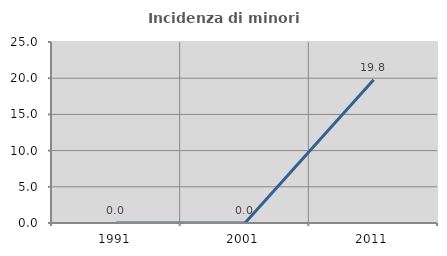
| Category | Incidenza di minori stranieri |
|---|---|
| 1991.0 | 0 |
| 2001.0 | 0 |
| 2011.0 | 19.802 |